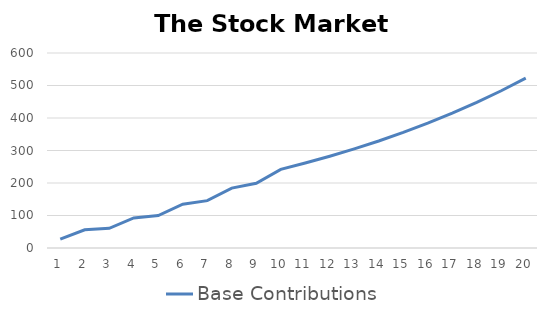
| Category | Base Contributions |
|---|---|
| 0 | 27 |
| 1 | 56.16 |
| 2 | 60.653 |
| 3 | 92.505 |
| 4 | 99.905 |
| 5 | 134.898 |
| 6 | 145.69 |
| 7 | 184.345 |
| 8 | 199.092 |
| 9 | 242.02 |
| 10 | 261.381 |
| 11 | 282.292 |
| 12 | 304.875 |
| 13 | 329.265 |
| 14 | 355.607 |
| 15 | 384.055 |
| 16 | 414.779 |
| 17 | 447.962 |
| 18 | 483.799 |
| 19 | 522.503 |